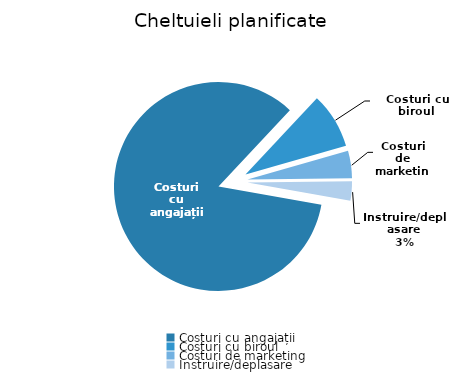
| Category | Series 0 |
|---|---|
| Costuri cu angajații | 1355090 |
| Costuri cu biroul | 138740 |
| Costuri de marketing | 67800 |
| Instruire/deplasare | 48000 |